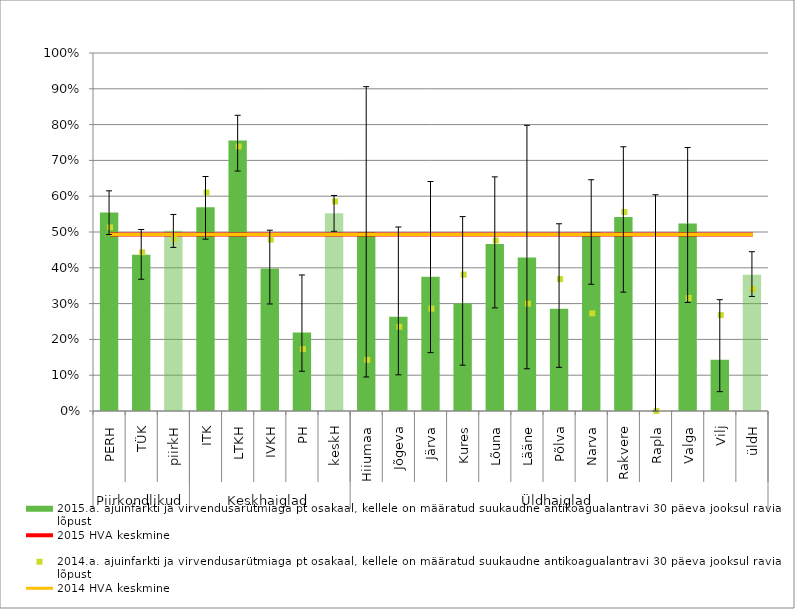
| Category | 2015.a. ajuinfarkti ja virvendusarütmiaga pt osakaal, kellele on määratud suukaudne antikoagualantravi 30 päeva jooksul raviarve lõpust |
|---|---|
| 0 | 0.554 |
| 1 | 0.436 |
| 2 | 0.503 |
| 3 | 0.569 |
| 4 | 0.756 |
| 5 | 0.398 |
| 6 | 0.22 |
| 7 | 0.552 |
| 8 | 0.5 |
| 9 | 0.263 |
| 10 | 0.375 |
| 11 | 0.3 |
| 12 | 0.467 |
| 13 | 0.429 |
| 14 | 0.286 |
| 15 | 0.5 |
| 16 | 0.542 |
| 17 | 0 |
| 18 | 0.524 |
| 19 | 0.143 |
| 20 | 0.381 |